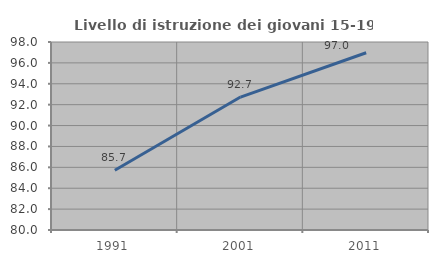
| Category | Livello di istruzione dei giovani 15-19 anni |
|---|---|
| 1991.0 | 85.714 |
| 2001.0 | 92.727 |
| 2011.0 | 96.97 |